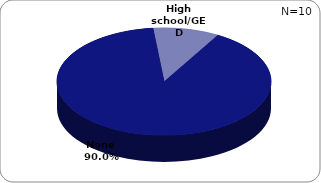
| Category | Series 0 |
|---|---|
| None | 0.9 |
| High school/GED | 0.1 |